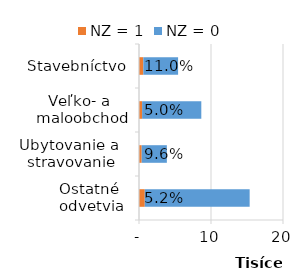
| Category | NZ = 1 | NZ = 0 |
|---|---|---|
| Stavebníctvo | 599 | 4830 |
| Veľko- a 
maloobchod | 433 | 8221 |
| Ubytovanie a 
stravovanie | 373 | 3497 |
| Ostatné 
odvetvia | 802 | 14567 |